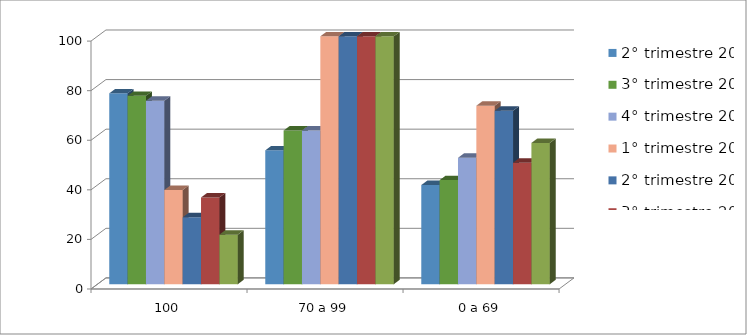
| Category | 2° trimestre 2020 | 3° trimestre 2020 | 4° trimestre 2020 | 1° trimestre 2021 | 2° trimestre 2021 | 3° trimestre 2021 | 4° trimestre 2021 |
|---|---|---|---|---|---|---|---|
| 100 | 77 | 76 | 74 | 38 | 27 | 35 | 20 |
| 70 a 99 | 54 | 62 | 62 | 101 | 116 | 103 | 108 |
| 0 a 69 | 40 | 42 | 51 | 72 | 70 | 49 | 57 |